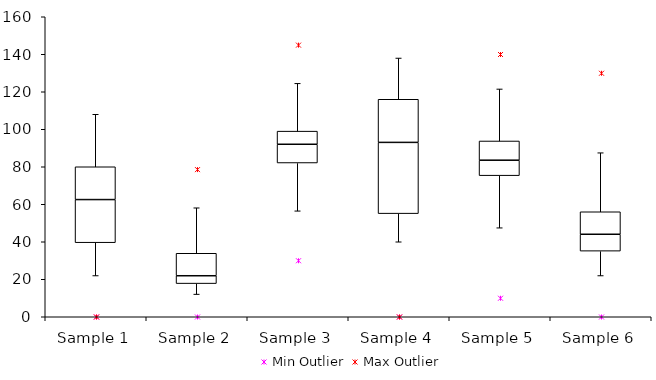
| Category | Q1 | Q2-Q1 | Q3-Q2 |
|---|---|---|---|
| Sample 1 | 39.5 | 23 | 17.5 |
| Sample 2 | 17.683 | 4.187 | 11.994 |
| Sample 3 | 82 | 10 | 7 |
| Sample 4 | 55 | 38 | 23 |
| Sample 5 | 75.25 | 8.25 | 10.25 |
| Sample 6 | 35 | 9 | 12 |